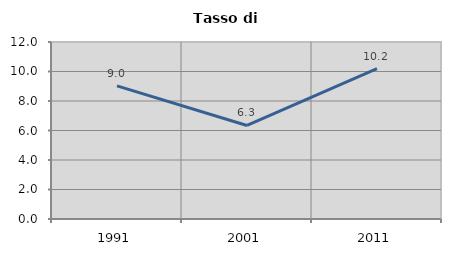
| Category | Tasso di disoccupazione   |
|---|---|
| 1991.0 | 9.021 |
| 2001.0 | 6.342 |
| 2011.0 | 10.189 |